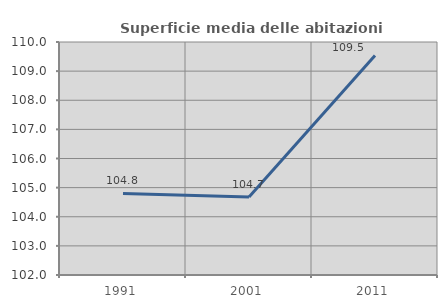
| Category | Superficie media delle abitazioni occupate |
|---|---|
| 1991.0 | 104.802 |
| 2001.0 | 104.675 |
| 2011.0 | 109.533 |